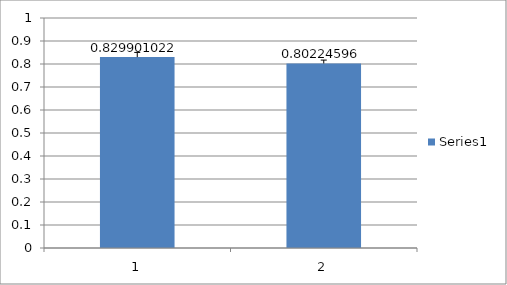
| Category | Series 0 |
|---|---|
| 0 | 0.83 |
| 1 | 0.802 |